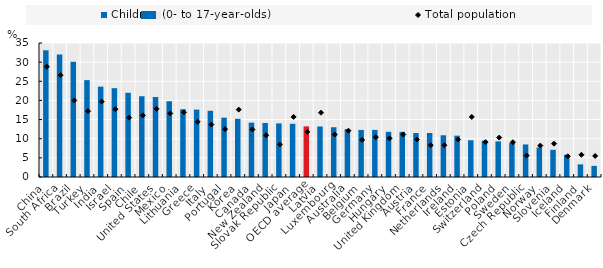
| Category | Children (0- to 17-year-olds) |
|---|---|
| 0 | 33.1 |
| 1 | 32 |
| 2 | 30.1 |
| 3 | 25.3 |
| 4 | 23.6 |
| 5 | 23.2 |
| 6 | 22 |
| 7 | 21.1 |
| 8 | 20.9 |
| 9 | 19.8 |
| 10 | 17.7 |
| 11 | 17.6 |
| 12 | 17.3 |
| 13 | 15.5 |
| 14 | 15.2 |
| 15 | 14.2 |
| 16 | 14.1 |
| 17 | 14 |
| 18 | 13.9 |
| 19 | 13.222 |
| 20 | 13.2 |
| 21 | 13 |
| 22 | 12.5 |
| 23 | 12.3 |
| 24 | 12.3 |
| 25 | 11.8 |
| 26 | 11.8 |
| 27 | 11.5 |
| 28 | 11.5 |
| 29 | 10.9 |
| 30 | 10.8 |
| 31 | 9.6 |
| 32 | 9.5 |
| 33 | 9.3 |
| 34 | 8.9 |
| 35 | 8.5 |
| 36 | 7.7 |
| 37 | 7.1 |
| 38 | 5.8 |
| 39 | 3.3 |
| 40 | 2.9 |